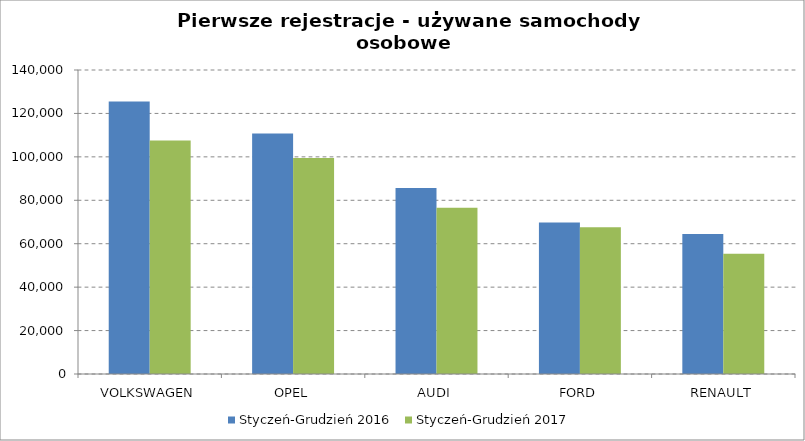
| Category | Styczeń-Grudzień 2016 | Styczeń-Grudzień 2017 |
|---|---|---|
| VOLKSWAGEN | 125447 | 107584 |
| OPEL | 110707 | 99501 |
| AUDI | 85696 | 76524 |
| FORD | 69811 | 67570 |
| RENAULT | 64422 | 55366 |